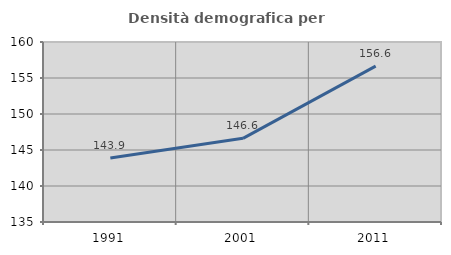
| Category | Densità demografica |
|---|---|
| 1991.0 | 143.882 |
| 2001.0 | 146.624 |
| 2011.0 | 156.644 |